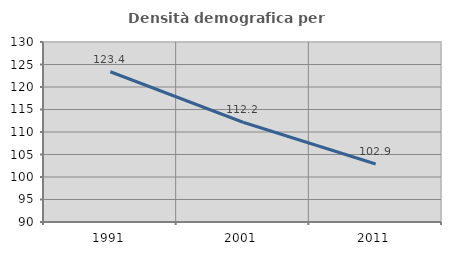
| Category | Densità demografica |
|---|---|
| 1991.0 | 123.388 |
| 2001.0 | 112.171 |
| 2011.0 | 102.886 |